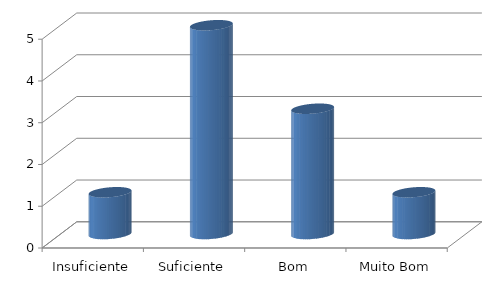
| Category | Series 0 |
|---|---|
| Insuficiente | 1 |
| Suficiente | 5 |
| Bom | 3 |
| Muito Bom | 1 |